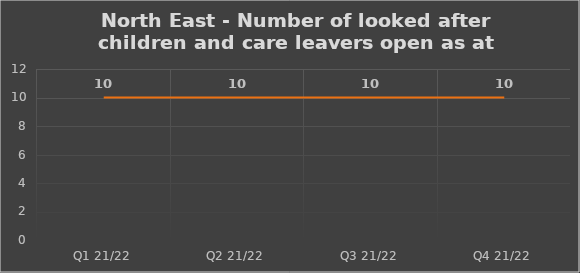
| Category | Number of open cases  |
|---|---|
| Q1 21/22 | 10 |
| Q2 21/22 | 10 |
| Q3 21/22 | 10 |
| Q4 21/22 | 10 |